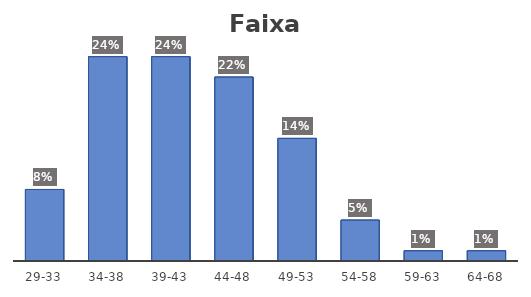
| Category | Series 0 |
|---|---|
| 29-33 | 0.084 |
| 34-38 | 0.241 |
| 39-43 | 0.241 |
| 44-48 | 0.217 |
| 49-53 | 0.145 |
| 54-58 | 0.048 |
| 59-63 | 0.012 |
| 64-68 | 0.012 |